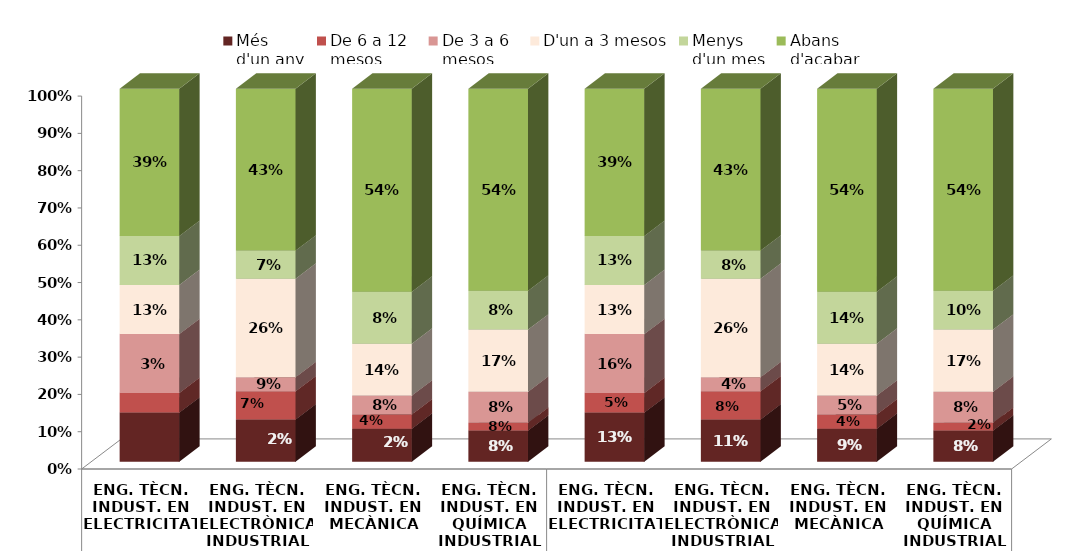
| Category | Més
d'un any | De 6 a 12
mesos | De 3 a 6
mesos | D'un a 3 mesos | Menys
d'un mes | Abans
d'acabar |
|---|---|---|---|---|---|---|
| 0 | 0.132 | 0.053 | 0.158 | 0.132 | 0.132 | 0.395 |
| 1 | 0.113 | 0.075 | 0.038 | 0.264 | 0.075 | 0.434 |
| 2 | 0.089 | 0.038 | 0.051 | 0.139 | 0.139 | 0.544 |
| 3 | 0.083 | 0.021 | 0.083 | 0.167 | 0.104 | 0.542 |
| 4 | 0.132 | 0.053 | 0.158 | 0.132 | 0.132 | 0.395 |
| 5 | 0.113 | 0.075 | 0.038 | 0.264 | 0.075 | 0.434 |
| 6 | 0.089 | 0.038 | 0.051 | 0.139 | 0.139 | 0.544 |
| 7 | 0.083 | 0.021 | 0.083 | 0.167 | 0.104 | 0.542 |